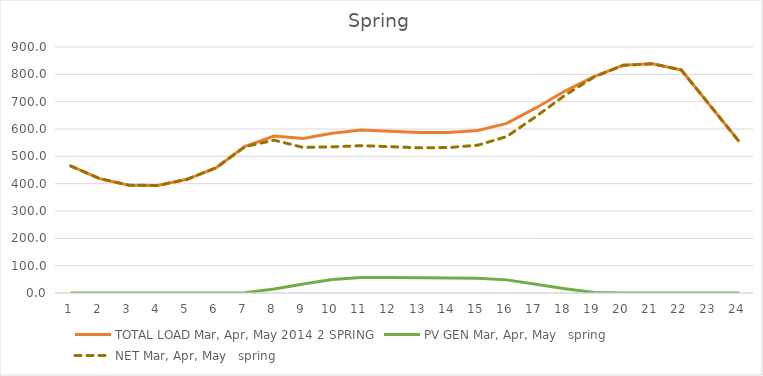
| Category | TOTAL LOAD | PV GEN | NET |
|---|---|---|---|
| 0 | 464.834 | 0 | 464.834 |
| 1 | 418.569 | 0 | 418.569 |
| 2 | 394.582 | 0 | 394.582 |
| 3 | 393.367 | 0 | 393.367 |
| 4 | 415.895 | 0 | 415.895 |
| 5 | 457.896 | 0.005 | 457.891 |
| 6 | 536.876 | 1.34 | 535.536 |
| 7 | 573.981 | 14.902 | 559.079 |
| 8 | 565.367 | 32.917 | 532.45 |
| 9 | 584.075 | 49.45 | 534.625 |
| 10 | 596.178 | 57.147 | 539.031 |
| 11 | 592.08 | 56.813 | 535.268 |
| 12 | 587.066 | 55.9 | 531.166 |
| 13 | 587.328 | 55.21 | 532.118 |
| 14 | 594.811 | 54.201 | 540.609 |
| 15 | 620.457 | 48.013 | 572.444 |
| 16 | 677.107 | 31.729 | 645.378 |
| 17 | 738.885 | 15.477 | 723.409 |
| 18 | 791.798 | 1.581 | 790.217 |
| 19 | 832.917 | 0.001 | 832.915 |
| 20 | 838.816 | 0 | 838.816 |
| 21 | 816.092 | 0 | 816.092 |
| 22 | 684.696 | 0 | 684.696 |
| 23 | 552.744 | 0 | 552.744 |